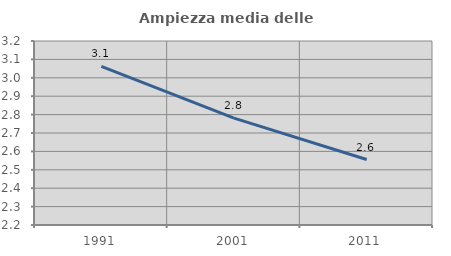
| Category | Ampiezza media delle famiglie |
|---|---|
| 1991.0 | 3.062 |
| 2001.0 | 2.781 |
| 2011.0 | 2.556 |